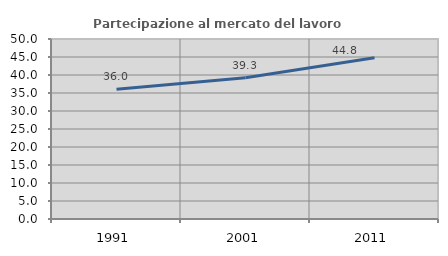
| Category | Partecipazione al mercato del lavoro  femminile |
|---|---|
| 1991.0 | 36.042 |
| 2001.0 | 39.26 |
| 2011.0 | 44.808 |